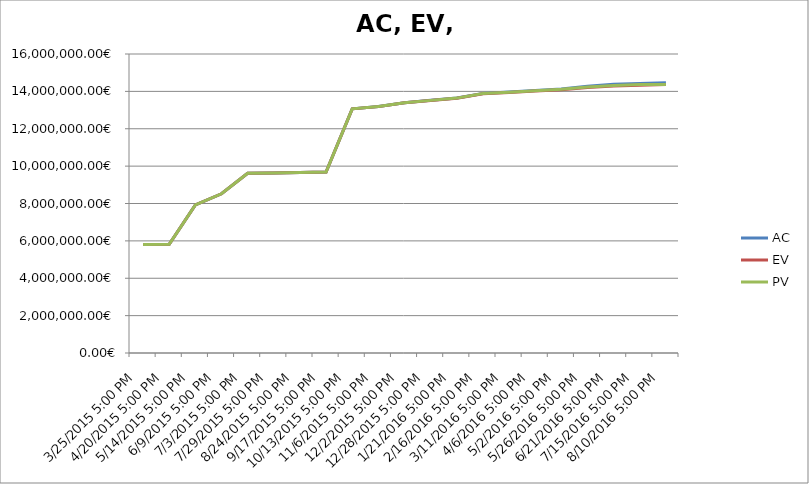
| Category | AC | EV | PV |
|---|---|---|---|
| 3/25/2015 5:00 PM | 5808100 | 5808027.235 | 5808100 |
| 4/20/2015 5:00 PM | 5816200 | 5816054.47 | 5816200 |
| 5/14/2015 5:00 PM | 7926325 | 7926106.705 | 7926325 |
| 6/9/2015 5:00 PM | 8520050 | 8519758.94 | 8520050 |
| 7/3/2015 5:00 PM | 9617375 | 9617011.176 | 9617375 |
| 7/29/2015 5:00 PM | 9637625 | 9637188.41 | 9637625 |
| 8/24/2015 5:00 PM | 9657875 | 9657365.644 | 9657875 |
| 9/17/2015 5:00 PM | 9681275 | 9679760.048 | 9681275 |
| 10/13/2015 5:00 PM | 13066375 | 13063587.923 | 13066375 |
| 11/6/2015 5:00 PM | 13187875 | 13183815.804 | 13187875 |
| 12/2/2015 5:00 PM | 13395725 | 13390007.967 | 13395725 |
| 12/28/2015 5:00 PM | 13519025 | 13511521.557 | 13518125 |
| 1/21/2016 5:00 PM | 13640525 | 13631749.444 | 13639625 |
| 2/16/2016 5:00 PM | 13883725 | 13872098.371 | 13881400 |
| 3/11/2016 5:00 PM | 13961925 | 13941068.6 | 13959250 |
| 4/6/2016 5:00 PM | 14046525 | 14015535.224 | 14033500 |
| 5/2/2016 5:00 PM | 14127525 | 14084240.061 | 14114500 |
| 5/26/2016 5:00 PM | 14274225 | 14213010.752 | 14237750 |
| 6/21/2016 5:00 PM | 14375500 | 14294101.437 | 14312225 |
| 7/15/2016 5:00 PM | 14425900 | 14332419.064 | 14362625 |
| 8/10/2016 5:00 PM | 14466100 | 14362625 | 14362625 |